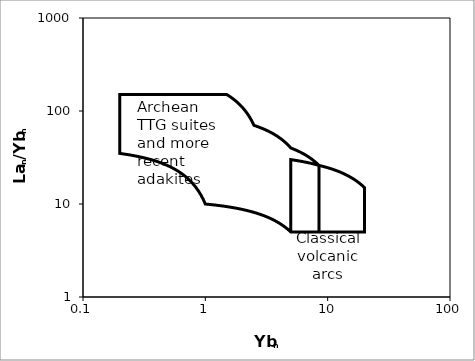
| Category | Series 0 |
|---|---|
| 8.5 | 5 |
| 20.0 | 5 |
| 20.0 | 15 |
| 19.425 | 15.55 |
| 18.85 | 16.1 |
| 18.275000000000002 | 16.65 |
| 17.700000000000003 | 17.2 |
| 17.125000000000004 | 17.75 |
| 16.550000000000004 | 18.3 |
| 15.975000000000005 | 18.85 |
| 15.400000000000006 | 19.4 |
| 14.825000000000006 | 19.95 |
| 14.250000000000007 | 20.5 |
| 13.675000000000008 | 21.05 |
| 13.100000000000009 | 21.6 |
| 12.52500000000001 | 22.15 |
| 11.95000000000001 | 22.7 |
| 11.37500000000001 | 23.25 |
| 10.800000000000011 | 23.8 |
| 10.225000000000012 | 24.35 |
| 9.650000000000013 | 24.9 |
| 9.075000000000014 | 25.45 |
| 8.5 | 26 |
| 8.325 | 26.7 |
| 8.149999999999999 | 27.4 |
| 7.974999999999999 | 28.1 |
| 7.799999999999999 | 28.8 |
| 7.624999999999999 | 29.5 |
| 7.449999999999999 | 30.2 |
| 7.2749999999999995 | 30.9 |
| 7.1 | 31.6 |
| 6.925 | 32.3 |
| 6.75 | 33 |
| 6.575 | 33.7 |
| 6.4 | 34.4 |
| 6.2250000000000005 | 35.1 |
| 6.050000000000001 | 35.8 |
| 5.875000000000001 | 36.5 |
| 5.700000000000001 | 37.2 |
| 5.525000000000001 | 37.9 |
| 5.350000000000001 | 38.6 |
| 5.175000000000002 | 39.3 |
| 5.0 | 40 |
| 4.875 | 41.5 |
| 4.75 | 43 |
| 4.625 | 44.5 |
| 4.5 | 46 |
| 4.375 | 47.5 |
| 4.25 | 49 |
| 4.125 | 50.5 |
| 4.0 | 52 |
| 3.875 | 53.5 |
| 3.75 | 55 |
| 3.625 | 56.5 |
| 3.5 | 58 |
| 3.375 | 59.5 |
| 3.25 | 61 |
| 3.125 | 62.5 |
| 3.0 | 64 |
| 2.875 | 65.5 |
| 2.75 | 67 |
| 2.625 | 68.5 |
| 2.5 | 70 |
| 2.45 | 74 |
| 2.4000000000000004 | 78 |
| 2.3500000000000005 | 82 |
| 2.3000000000000007 | 86 |
| 2.250000000000001 | 90 |
| 2.200000000000001 | 94 |
| 2.1500000000000012 | 98 |
| 2.1000000000000014 | 102 |
| 2.0500000000000016 | 106 |
| 2.0000000000000018 | 110 |
| 1.9500000000000017 | 114 |
| 1.9000000000000017 | 118 |
| 1.8500000000000016 | 122 |
| 1.8000000000000016 | 126 |
| 1.7500000000000016 | 130 |
| 1.7000000000000015 | 134 |
| 1.6500000000000015 | 138 |
| 1.6000000000000014 | 142 |
| 1.5500000000000014 | 146 |
| 1.5 | 150 |
| 0.2 | 150 |
| 0.2 | 35 |
| 0.24000000000000002 | 33.75 |
| 0.28 | 32.5 |
| 0.32 | 31.25 |
| 0.36 | 30 |
| 0.39999999999999997 | 28.75 |
| 0.43999999999999995 | 27.5 |
| 0.4799999999999999 | 26.25 |
| 0.5199999999999999 | 25 |
| 0.5599999999999999 | 23.75 |
| 0.6 | 22.5 |
| 0.64 | 21.25 |
| 0.68 | 20 |
| 0.7200000000000001 | 18.75 |
| 0.7600000000000001 | 17.5 |
| 0.8000000000000002 | 16.25 |
| 0.8400000000000002 | 15 |
| 0.8800000000000002 | 13.75 |
| 0.9200000000000003 | 12.5 |
| 0.9600000000000003 | 11.25 |
| 1.0 | 10 |
| 1.2 | 9.75 |
| 1.4 | 9.5 |
| 1.5999999999999999 | 9.25 |
| 1.7999999999999998 | 9 |
| 1.9999999999999998 | 8.75 |
| 2.1999999999999997 | 8.5 |
| 2.4 | 8.25 |
| 2.6 | 8 |
| 2.8000000000000003 | 7.75 |
| 3.0000000000000004 | 7.5 |
| 3.2000000000000006 | 7.25 |
| 3.400000000000001 | 7 |
| 3.600000000000001 | 6.75 |
| 3.800000000000001 | 6.5 |
| 4.000000000000001 | 6.25 |
| 4.200000000000001 | 6 |
| 4.400000000000001 | 5.75 |
| 4.600000000000001 | 5.5 |
| 4.800000000000002 | 5.25 |
| 5.0 | 5 |
| 8.5 | 5 |
| 8.5 | 26 |
| 8.325 | 26.2 |
| 8.149999999999999 | 26.4 |
| 7.974999999999999 | 26.6 |
| 7.799999999999999 | 26.8 |
| 7.624999999999999 | 27 |
| 7.449999999999999 | 27.2 |
| 7.2749999999999995 | 27.4 |
| 7.1 | 27.6 |
| 6.925 | 27.8 |
| 6.75 | 28 |
| 6.575 | 28.2 |
| 6.4 | 28.4 |
| 6.2250000000000005 | 28.6 |
| 6.050000000000001 | 28.8 |
| 5.875000000000001 | 29 |
| 5.700000000000001 | 29.2 |
| 5.525000000000001 | 29.4 |
| 5.350000000000001 | 29.6 |
| 5.175000000000002 | 29.8 |
| 5.0 | 30 |
| 5.0 | 5 |